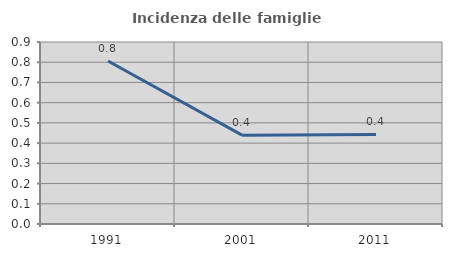
| Category | Incidenza delle famiglie numerose |
|---|---|
| 1991.0 | 0.806 |
| 2001.0 | 0.439 |
| 2011.0 | 0.443 |